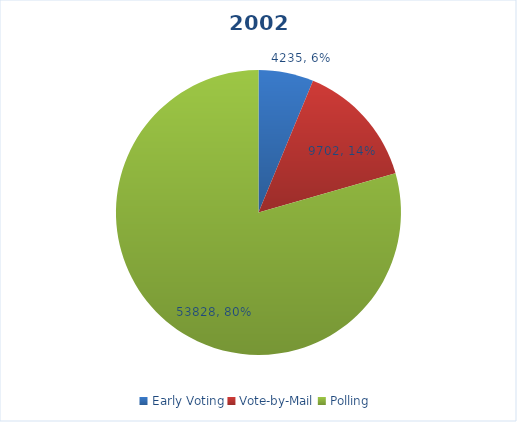
| Category | Series 0 |
|---|---|
| Early Voting | 4235 |
| Vote-by-Mail | 9702 |
| Polling | 53828 |